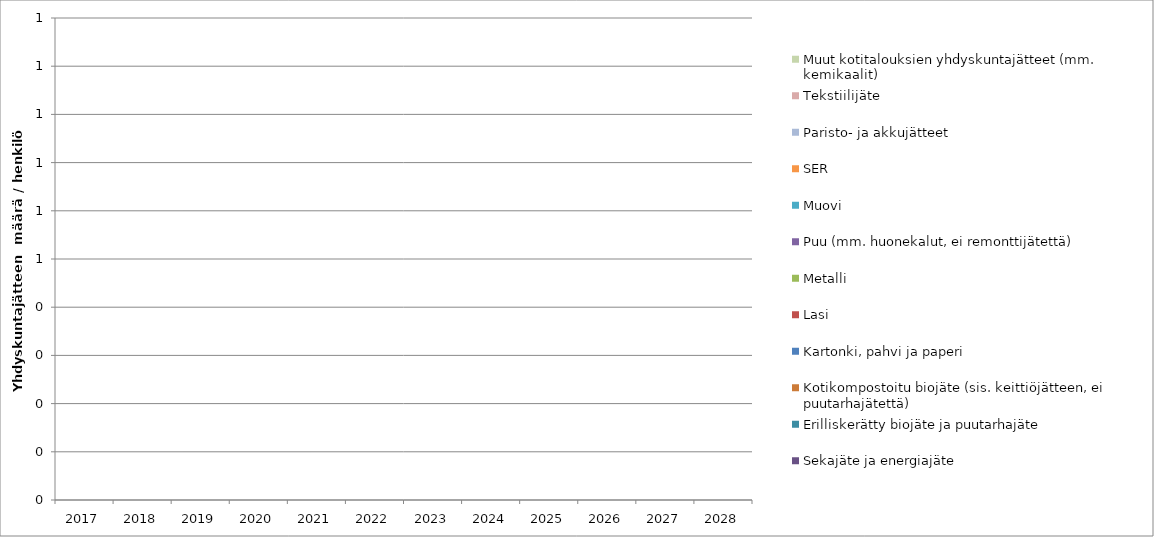
| Category | Sekajäte ja energiajäte | Erilliskerätty biojäte ja puutarhajäte | Kotikompostoitu biojäte (sis. keittiöjätteen, ei puutarhajätettä) | Kartonki, pahvi ja paperi | Lasi | Metalli | Puu (mm. huonekalut, ei remonttijätettä) | Muovi | SER | Paristo- ja akkujätteet | Tekstiilijäte | Muut kotitalouksien yhdyskuntajätteet (mm. kemikaalit) |
|---|---|---|---|---|---|---|---|---|---|---|---|---|
| 2017.0 | 0 | 0 | 0 | 0 | 0 | 0 | 0 | 0 | 0 | 0 | 0 | 0 |
| 2018.0 | 0 | 0 | 0 | 0 | 0 | 0 | 0 | 0 | 0 | 0 | 0 | 0 |
| 2019.0 | 0 | 0 | 0 | 0 | 0 | 0 | 0 | 0 | 0 | 0 | 0 | 0 |
| 2020.0 | 0 | 0 | 0 | 0 | 0 | 0 | 0 | 0 | 0 | 0 | 0 | 0 |
| 2021.0 | 0 | 0 | 0 | 0 | 0 | 0 | 0 | 0 | 0 | 0 | 0 | 0 |
| 2022.0 | 0 | 0 | 0 | 0 | 0 | 0 | 0 | 0 | 0 | 0 | 0 | 0 |
| 2023.0 | 0 | 0 | 0 | 0 | 0 | 0 | 0 | 0 | 0 | 0 | 0 | 0 |
| 2024.0 | 0 | 0 | 0 | 0 | 0 | 0 | 0 | 0 | 0 | 0 | 0 | 0 |
| 2025.0 | 0 | 0 | 0 | 0 | 0 | 0 | 0 | 0 | 0 | 0 | 0 | 0 |
| 2026.0 | 0 | 0 | 0 | 0 | 0 | 0 | 0 | 0 | 0 | 0 | 0 | 0 |
| 2027.0 | 0 | 0 | 0 | 0 | 0 | 0 | 0 | 0 | 0 | 0 | 0 | 0 |
| 2028.0 | 0 | 0 | 0 | 0 | 0 | 0 | 0 | 0 | 0 | 0 | 0 | 0 |